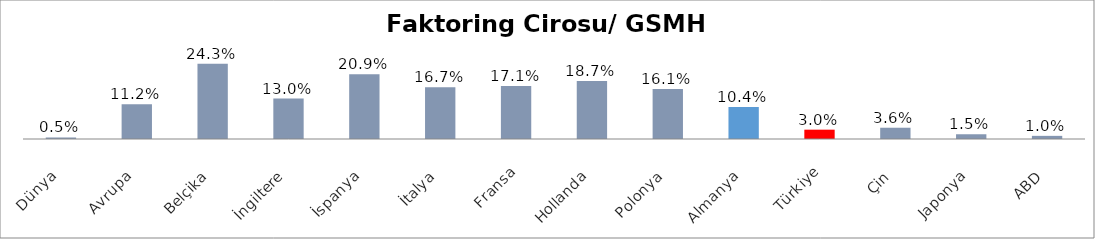
| Category | Faktoring Cirosu/ GSMH (%) |
|---|---|
| Dünya | 0.005 |
| Avrupa | 0.112 |
| Belçika | 0.243 |
| İngiltere | 0.13 |
| İspanya | 0.209 |
| İtalya | 0.167 |
| Fransa | 0.171 |
| Hollanda | 0.187 |
| Polonya | 0.161 |
| Almanya | 0.104 |
| Türkiye | 0.03 |
| Çin | 0.036 |
| Japonya | 0.015 |
| ABD | 0.01 |